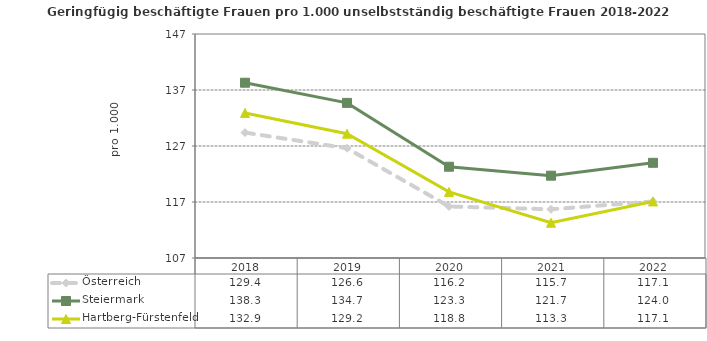
| Category | Österreich | Steiermark | Hartberg-Fürstenfeld |
|---|---|---|---|
| 2022.0 | 117.1 | 124 | 117.1 |
| 2021.0 | 115.7 | 121.7 | 113.3 |
| 2020.0 | 116.2 | 123.3 | 118.8 |
| 2019.0 | 126.6 | 134.7 | 129.2 |
| 2018.0 | 129.4 | 138.3 | 132.9 |